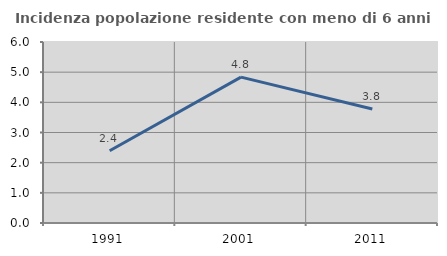
| Category | Incidenza popolazione residente con meno di 6 anni |
|---|---|
| 1991.0 | 2.394 |
| 2001.0 | 4.836 |
| 2011.0 | 3.777 |